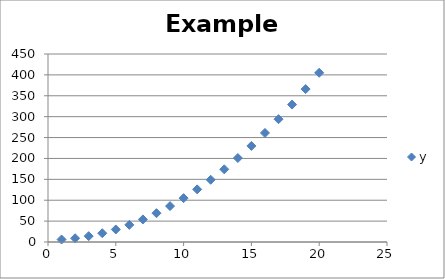
| Category | y |
|---|---|
| 1.0 | 6 |
| 2.0 | 9 |
| 3.0 | 14 |
| 4.0 | 21 |
| 5.0 | 30 |
| 6.0 | 41 |
| 7.0 | 54 |
| 8.0 | 69 |
| 9.0 | 86 |
| 10.0 | 105 |
| 11.0 | 126 |
| 12.0 | 149 |
| 13.0 | 174 |
| 14.0 | 201 |
| 15.0 | 230 |
| 16.0 | 261 |
| 17.0 | 294 |
| 18.0 | 329 |
| 19.0 | 366 |
| 20.0 | 405 |